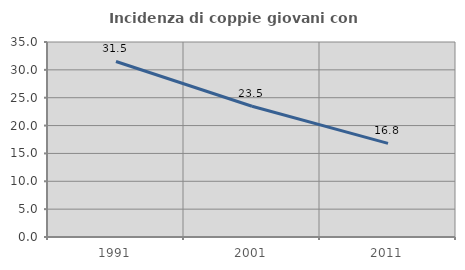
| Category | Incidenza di coppie giovani con figli |
|---|---|
| 1991.0 | 31.508 |
| 2001.0 | 23.47 |
| 2011.0 | 16.799 |